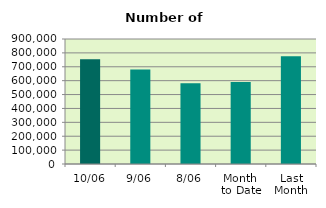
| Category | Series 0 |
|---|---|
| 10/06 | 753986 |
| 9/06 | 680544 |
| 8/06 | 580938 |
| Month 
to Date | 590047.75 |
| Last
Month | 776305.545 |